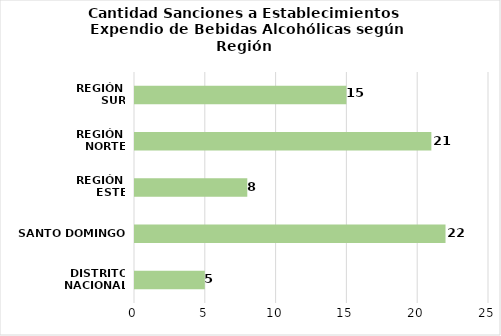
| Category | Series 0 |
|---|---|
| DISTRITO NACIONAL | 5 |
| SANTO DOMINGO | 22 |
| REGIÓN 
ESTE | 8 |
| REGIÓN 
NORTE | 21 |
| REGIÓN 
SUR | 15 |